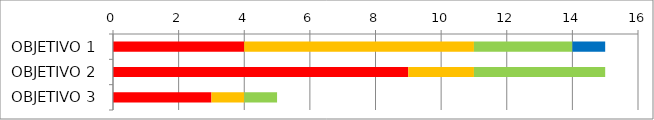
| Category | Series 0 | Series 1 | Series 2 | Series 3 | Series 4 | Series 5 |
|---|---|---|---|---|---|---|
| OBJETIVO 1 | 0 | 0 | 4 | 7 | 3 | 1 |
| OBJETIVO 2 | 0 | 0 | 9 | 2 | 4 | 0 |
| OBJETIVO 3 | 0 | 0 | 3 | 1 | 1 | 0 |